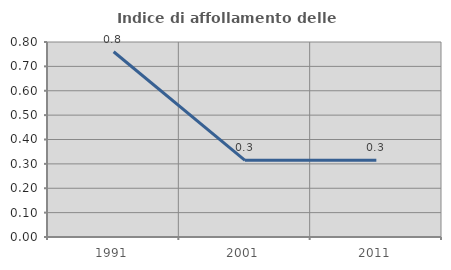
| Category | Indice di affollamento delle abitazioni  |
|---|---|
| 1991.0 | 0.76 |
| 2001.0 | 0.314 |
| 2011.0 | 0.315 |